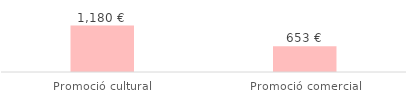
| Category | Total |
|---|---|
| Promoció cultural | 1179.75 |
| Promoció comercial | 653.4 |